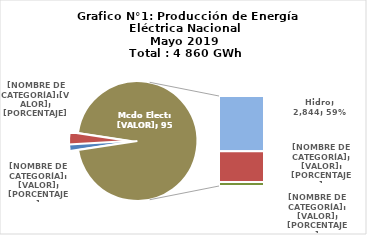
| Category | Series 0 |
|---|---|
| 0 | 72.311 |
| 1 | 160.951 |
| 2 | 2844.453 |
| 3 | 1581.837 |
| 4 | 200.068 |